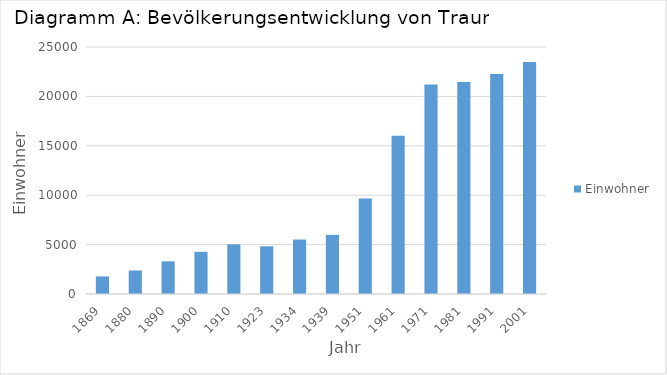
| Category | Einwohner |
|---|---|
| 1869.0 | 1781 |
| 1880.0 | 2378 |
| 1890.0 | 3308 |
| 1900.0 | 4271 |
| 1910.0 | 5026 |
| 1923.0 | 4830 |
| 1934.0 | 5512 |
| 1939.0 | 5985 |
| 1951.0 | 9655 |
| 1961.0 | 16026 |
| 1971.0 | 21215 |
| 1981.0 | 21464 |
| 1991.0 | 22260 |
| 2001.0 | 23470 |